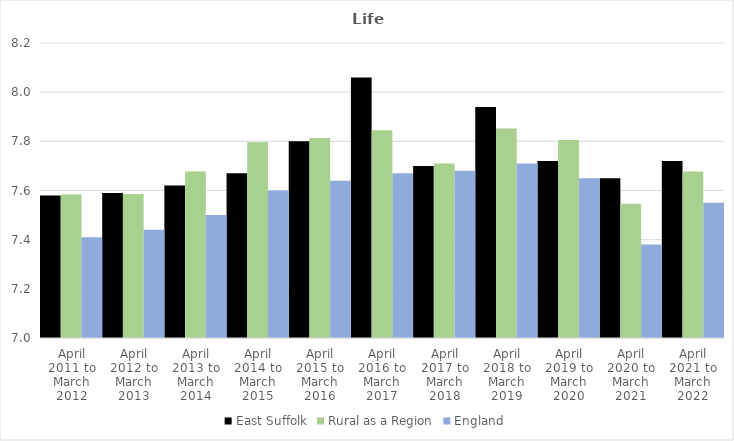
| Category | East Suffolk | Rural as a Region | England |
|---|---|---|---|
| April 2011 to March 2012 | 7.58 | 7.584 | 7.41 |
| April 2012 to March 2013 | 7.59 | 7.586 | 7.44 |
| April 2013 to March 2014 | 7.62 | 7.677 | 7.5 |
| April 2014 to March 2015 | 7.67 | 7.797 | 7.6 |
| April 2015 to March 2016 | 7.8 | 7.813 | 7.64 |
| April 2016 to March 2017 | 8.06 | 7.845 | 7.67 |
| April 2017 to March 2018 | 7.7 | 7.71 | 7.68 |
| April 2018 to March 2019 | 7.94 | 7.852 | 7.71 |
| April 2019 to March 2020 | 7.72 | 7.806 | 7.65 |
| April 2020 to March 2021 | 7.65 | 7.546 | 7.38 |
| April 2021 to March 2022 | 7.72 | 7.677 | 7.55 |